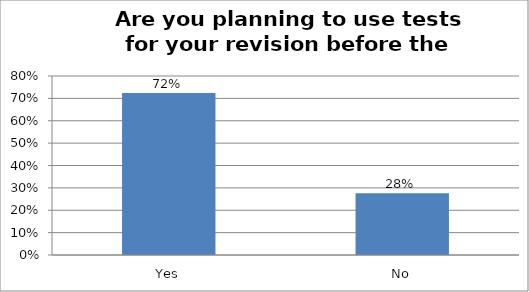
| Category | Series 0 |
|---|---|
| Yes | 0.724 |
| No | 0.276 |